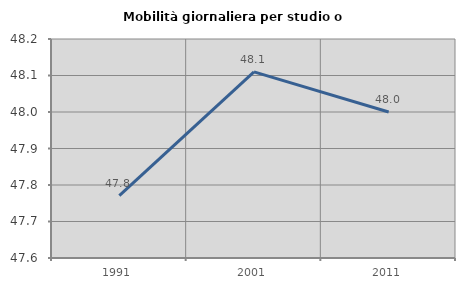
| Category | Mobilità giornaliera per studio o lavoro |
|---|---|
| 1991.0 | 47.771 |
| 2001.0 | 48.11 |
| 2011.0 | 48 |